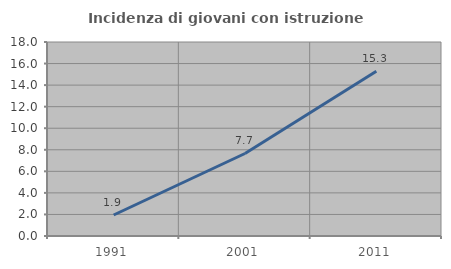
| Category | Incidenza di giovani con istruzione universitaria |
|---|---|
| 1991.0 | 1.948 |
| 2001.0 | 7.656 |
| 2011.0 | 15.278 |